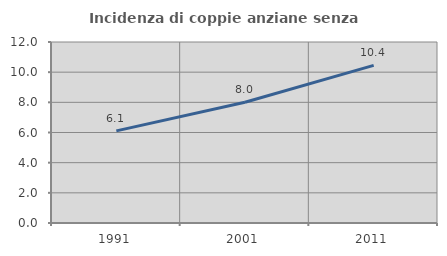
| Category | Incidenza di coppie anziane senza figli  |
|---|---|
| 1991.0 | 6.106 |
| 2001.0 | 8.009 |
| 2011.0 | 10.447 |